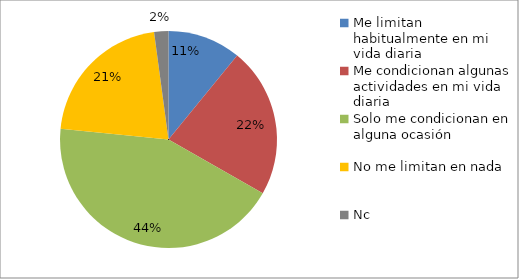
| Category | Series 0 | Series 1 | Series 2 |
|---|---|---|---|
| Me limitan habitualmente en mi vida diaria |  |  | 41 |
| Me condicionan algunas actividades en mi vida diaria |  |  | 84 |
| Solo me condicionan en alguna ocasión |  |  | 163 |
| No me limitan en nada |  |  | 80 |
| Nc |  |  | 8 |